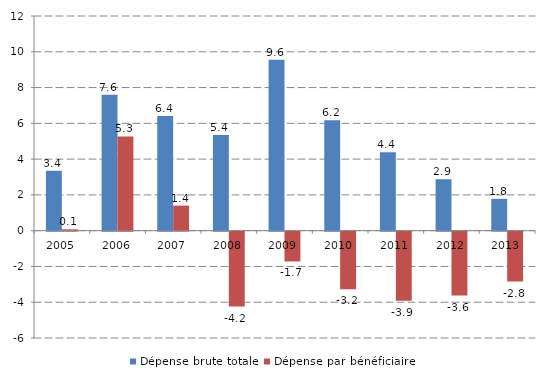
| Category | Dépense brute totale | Dépense par bénéficiaire |
|---|---|---|
| 2005.0 | 3.354 | 0.076 |
| 2006.0 | 7.601 | 5.27 |
| 2007.0 | 6.409 | 1.401 |
| 2008.0 | 5.353 | -4.188 |
| 2009.0 | 9.551 | -1.664 |
| 2010.0 | 6.169 | -3.224 |
| 2011.0 | 4.384 | -3.863 |
| 2012.0 | 2.874 | -3.574 |
| 2013.0 | 1.78 | -2.789 |